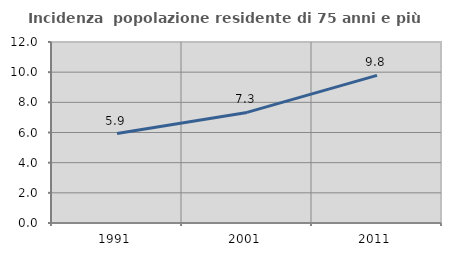
| Category | Incidenza  popolazione residente di 75 anni e più |
|---|---|
| 1991.0 | 5.933 |
| 2001.0 | 7.331 |
| 2011.0 | 9.787 |